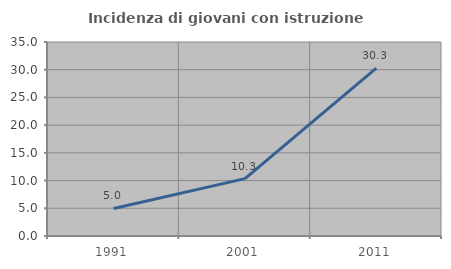
| Category | Incidenza di giovani con istruzione universitaria |
|---|---|
| 1991.0 | 4.965 |
| 2001.0 | 10.345 |
| 2011.0 | 30.303 |